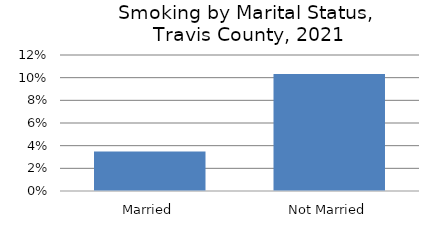
| Category | Series 0 |
|---|---|
| Married | 0.035 |
| Not Married | 0.103 |